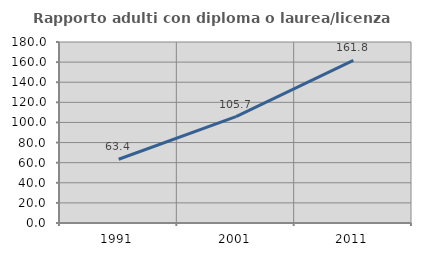
| Category | Rapporto adulti con diploma o laurea/licenza media  |
|---|---|
| 1991.0 | 63.399 |
| 2001.0 | 105.747 |
| 2011.0 | 161.798 |